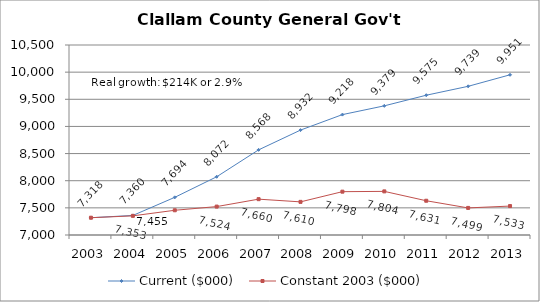
| Category | Current ($000) | Constant 2003 ($000) |
|---|---|---|
| 2003.0 | 7318.498 | 7318.498 |
| 2004.0 | 7360.11 | 7352.75 |
| 2005.0 | 7693.874 | 7455.364 |
| 2006.0 | 8072.464 | 7523.536 |
| 2007.0 | 8568.364 | 7660.117 |
| 2008.0 | 8932.385 | 7610.392 |
| 2009.0 | 9217.838 | 7798.291 |
| 2010.0 | 9379.258 | 7803.543 |
| 2011.0 | 9574.733 | 7631.062 |
| 2012.0 | 9738.725 | 7498.818 |
| 2013.0 | 9951 | 7532.907 |